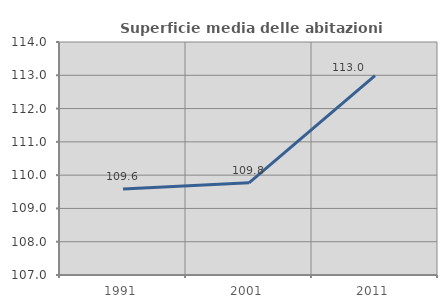
| Category | Superficie media delle abitazioni occupate |
|---|---|
| 1991.0 | 109.586 |
| 2001.0 | 109.77 |
| 2011.0 | 112.992 |